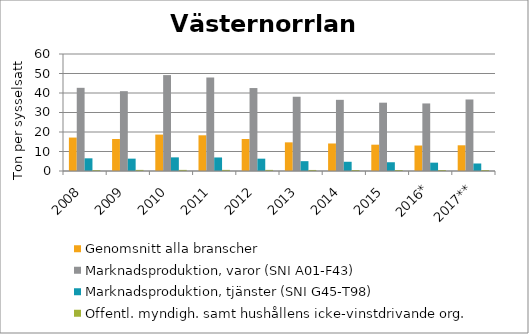
| Category | Genomsnitt alla branscher | Marknadsproduktion, varor (SNI A01-F43) | Marknadsproduktion, tjänster (SNI G45-T98) | Offentl. myndigh. samt hushållens icke-vinstdrivande org. |
|---|---|---|---|---|
| 2008 | 17.15 | 42.656 | 6.503 | 0.475 |
| 2009 | 16.399 | 40.945 | 6.333 | 0.568 |
| 2010 | 18.67 | 49.182 | 6.993 | 0.571 |
| 2011 | 18.313 | 47.898 | 6.941 | 0.573 |
| 2012 | 16.417 | 42.544 | 6.322 | 0.569 |
| 2013 | 14.694 | 38.076 | 5.042 | 0.536 |
| 2014 | 14.111 | 36.495 | 4.732 | 0.52 |
| 2015 | 13.494 | 35.036 | 4.488 | 0.517 |
| 2016* | 13.065 | 34.644 | 4.278 | 0.502 |
| 2017** | 13.184 | 36.676 | 3.852 | 0.48 |